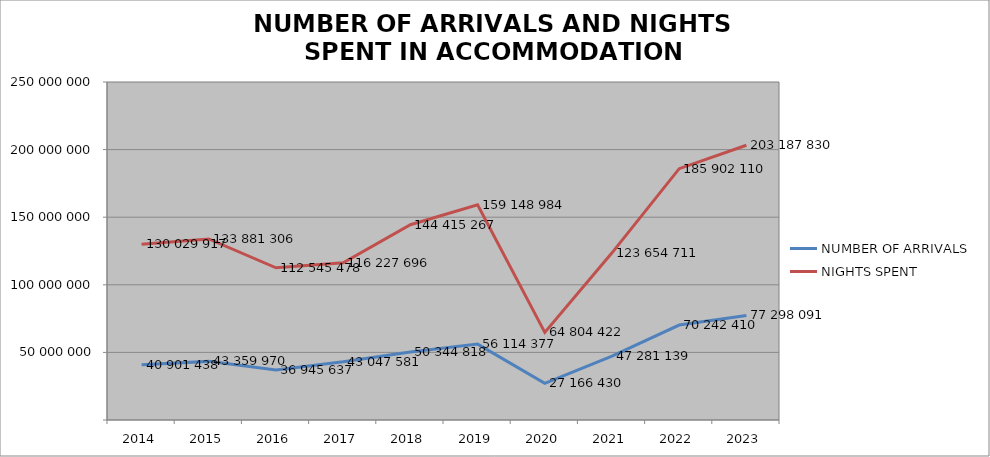
| Category | NUMBER OF ARRIVALS | NIGHTS SPENT |
|---|---|---|
| 2014 | 40901438 | 130029917 |
| 2015 | 43359970 | 133881306 |
| 2016 | 36945637 | 112545478 |
| 2017 | 43047581 | 116227696 |
| 2018 | 50344818 | 144415267 |
| 2019 | 56114377 | 159148984 |
| 2020 | 27166430 | 64804422 |
| 2021 | 47281139 | 123654711 |
| 2022 | 70242410 | 185902110 |
| 2023 | 77298091 | 203187830 |